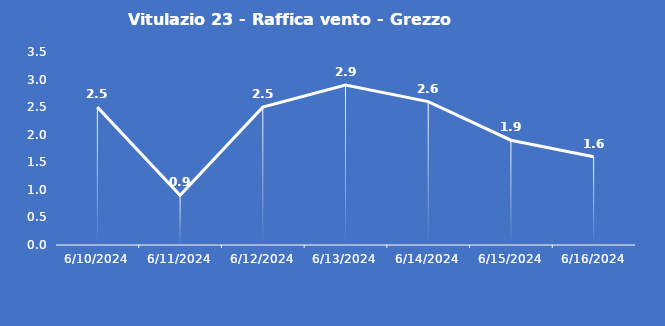
| Category | Vitulazio 23 - Raffica vento - Grezzo (m/s) |
|---|---|
| 6/10/24 | 2.5 |
| 6/11/24 | 0.9 |
| 6/12/24 | 2.5 |
| 6/13/24 | 2.9 |
| 6/14/24 | 2.6 |
| 6/15/24 | 1.9 |
| 6/16/24 | 1.6 |